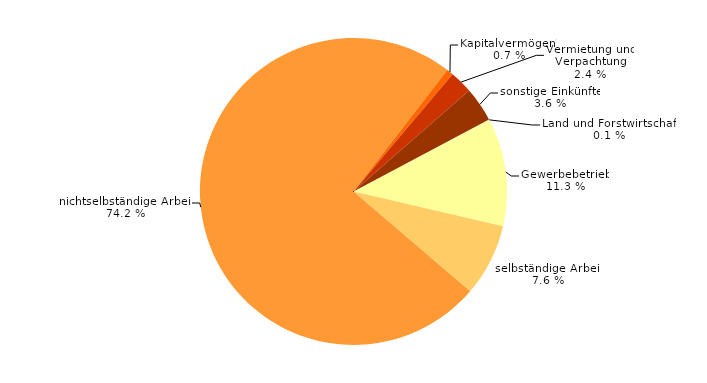
| Category | Series 0 |
|---|---|
| Land und Forstwirtschaft | 0.099 |
| Gewerbebetrieb | 11.304 |
| selbständige Arbeit | 7.643 |
| nichtselbständige Arbeit | 74.204 |
| Kapitalvermögen¹ | 0.686 |
| Vermietung und Verpachtung | 2.418 |
| sonstige Einkünfte | 3.646 |